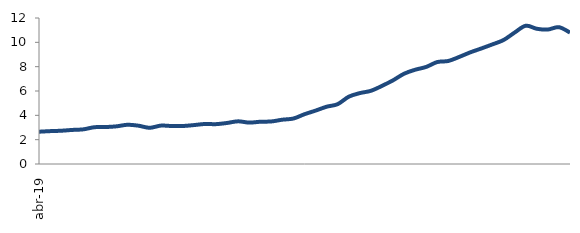
| Category | Series 0 |
|---|---|
| 2019-04-01 | 2.653 |
| 2019-05-01 | 2.702 |
| 2019-06-01 | 2.733 |
| 2019-07-01 | 2.799 |
| 2019-08-01 | 2.847 |
| 2019-09-01 | 3.023 |
| 2019-10-01 | 3.036 |
| 2019-11-01 | 3.095 |
| 2019-12-01 | 3.225 |
| 2020-01-01 | 3.148 |
| 2020-02-01 | 2.975 |
| 2020-03-01 | 3.153 |
| 2020-04-01 | 3.122 |
| 2020-05-01 | 3.123 |
| 2020-06-01 | 3.198 |
| 2020-07-01 | 3.289 |
| 2020-08-01 | 3.275 |
| 2020-09-01 | 3.372 |
| 2020-10-01 | 3.508 |
| 2020-11-01 | 3.402 |
| 2020-12-01 | 3.472 |
| 2021-01-01 | 3.496 |
| 2021-02-01 | 3.642 |
| 2021-03-01 | 3.737 |
| 2021-04-01 | 4.091 |
| 2021-05-01 | 4.388 |
| 2021-06-01 | 4.708 |
| 2021-07-01 | 4.92 |
| 2021-08-01 | 5.531 |
| 2021-09-01 | 5.826 |
| 2021-10-01 | 6.015 |
| 2021-11-01 | 6.418 |
| 2021-12-01 | 6.877 |
| 2022-01-01 | 7.419 |
| 2022-02-01 | 7.746 |
| 2022-03-01 | 7.979 |
| 2022-04-01 | 8.38 |
| 2022-05-01 | 8.468 |
| 2022-06-01 | 8.806 |
| 2022-07-01 | 9.181 |
| 2022-08-01 | 9.501 |
| 2022-09-01 | 9.836 |
| 2022-10-01 | 10.192 |
| 2022-11-01 | 10.808 |
| 2022-12-01 | 11.364 |
| 2023-01-01 | 11.115 |
| 2023-02-01 | 11.054 |
| 2023-03-01 | 11.245 |
| 2023-04-01 | 10.801 |